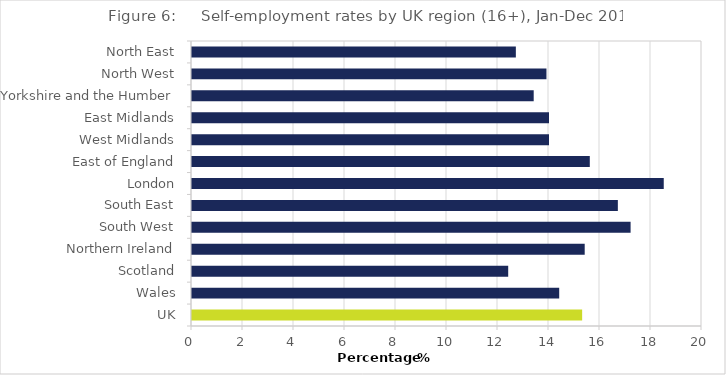
| Category | Self-employed |
|---|---|
| North East | 12.7 |
| North West | 13.9 |
| Yorkshire and the Humber | 13.4 |
| East Midlands | 14 |
| West Midlands | 14 |
| East of England | 15.6 |
| London | 18.5 |
| South East | 16.7 |
| South West | 17.2 |
| Northern Ireland | 15.4 |
| Scotland | 12.4 |
| Wales | 14.4 |
| UK | 15.3 |